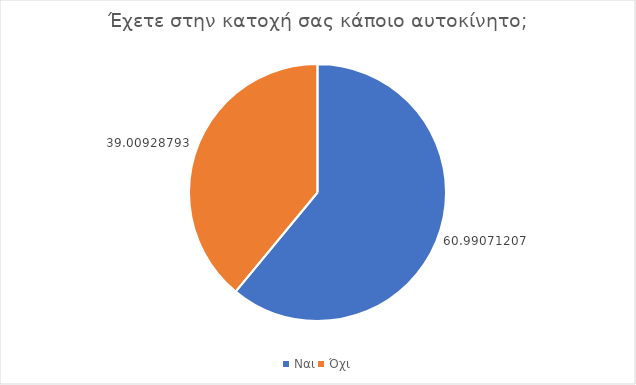
| Category | Series 1 | Series 2 | Series 0 |
|---|---|---|---|
| Ναι | 60.991 | 60.991 | 60.991 |
| Όχι | 39.009 | 39.009 | 39.009 |